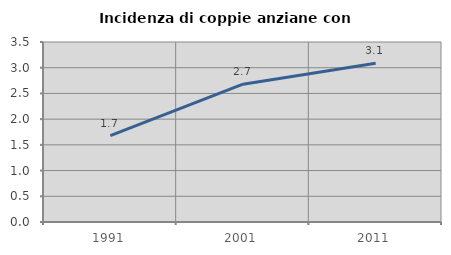
| Category | Incidenza di coppie anziane con figli |
|---|---|
| 1991.0 | 1.679 |
| 2001.0 | 2.68 |
| 2011.0 | 3.088 |